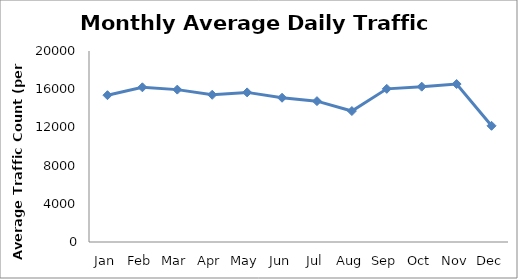
| Category | Series 0 |
|---|---|
| Jan | 15372.5 |
| Feb | 16198 |
| Mar | 15956.25 |
| Apr | 15414.75 |
| May | 15665.75 |
| Jun | 15105.5 |
| Jul | 14749.5 |
| Aug | 13714 |
| Sep | 16036.25 |
| Oct | 16263.75 |
| Nov | 16540 |
| Dec | 12167 |